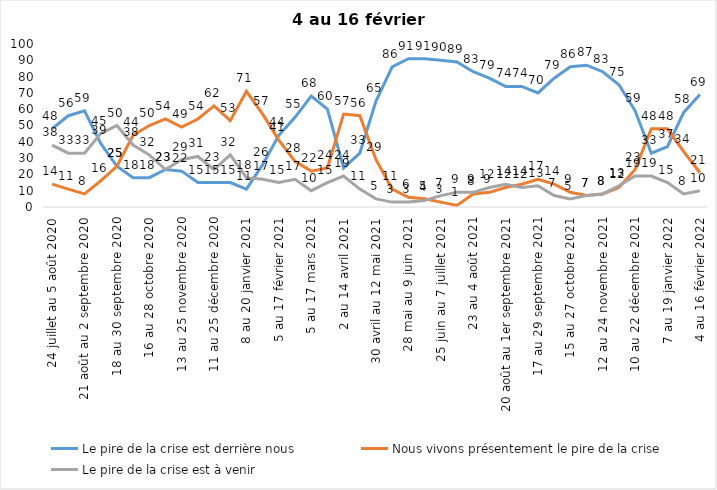
| Category | Le pire de la crise est derrière nous | Nous vivons présentement le pire de la crise | Le pire de la crise est à venir |
|---|---|---|---|
| 24 juillet au 5 août 2020 | 48 | 14 | 38 |
| 7 au 19 août 2020 | 56 | 11 | 33 |
| 21 août au 2 septembre 2020 | 59 | 8 | 33 |
| 4 au 16 septembre 2020 | 39 | 16 | 45 |
| 18 au 30 septembre 2020 | 25 | 25 | 50 |
| 2 au 14 octobre 2020 | 18 | 44 | 38 |
| 16 au 28 octobre 2020 | 18 | 50 | 32 |
| 30 octobre au 11 novembre 2020 | 23 | 54 | 23 |
| 13 au 25 novembre 2020 | 22 | 49 | 29 |
| 27 au 9 décembre 2020 | 15 | 54 | 31 |
| 11 au 25 décembre 2020 | 15 | 62 | 23 |
| 25 décembre 2020 au 6 janvier 2021 | 15 | 53 | 32 |
| 8 au 20 janvier 2021 | 11 | 71 | 18 |
| 22 janvier au 3 février 2021 | 26 | 57 | 17 |
| 5 au 17 février 2021 | 44 | 41 | 15 |
| 19 février au 3 mars 2021 | 55 | 28 | 17 |
| 5 au 17 mars 2021 | 68 | 22 | 10 |
| 19 au 31 mars 2021 | 60 | 24 | 15 |
| 2 au 14 avril 2021 | 24 | 57 | 19 |
| 16 au 28 avril 2021 | 33 | 56 | 11 |
| 30 avril au 12 mai 2021 | 65 | 29 | 5 |
| 14 au 26 mai 2021 | 86 | 11 | 3 |
| 28 mai au 9 juin 2021 | 91 | 6 | 3 |
| 11 au 23 juin 2021 | 91 | 5 | 4 |
| 25 juin au 7 juillet 2021 | 90 | 3 | 7 |
| 9 au 21 juillet 2021 | 89 | 1 | 9 |
| 23 au 4 août 2021 | 83 | 8 | 9 |
| 6 au 18 août 2021 | 79 | 9 | 12 |
| 20 août au 1er septembre 2021 | 74 | 12 | 14 |
| 3 au 15 septembre 2021 | 74 | 14 | 12 |
| 17 au 29 septembre 2021 | 70 | 17 | 13 |
| 1 au 13 octobre 2021 | 79 | 14 | 7 |
| 15 au 27 octobre 2021 | 86 | 9 | 5 |
| 29 octobre au 10 novembre 2021 | 87 | 7 | 7 |
| 12 au 24 novembre 2021 | 83 | 8 | 8 |
| 26 novembre au 8 décembre 2021 | 75 | 12 | 13 |
| 10 au 22 décembre 2021 | 59 | 23 | 19 |
| 24 décembre 2021 au 5 janvier 2022 | 33 | 48 | 19 |
| 7 au 19 janvier 2022 | 37 | 48 | 15 |
| 21 janvier au 2 février 2022 | 58 | 34 | 8 |
| 4 au 16 février 2022 | 69 | 21 | 10 |